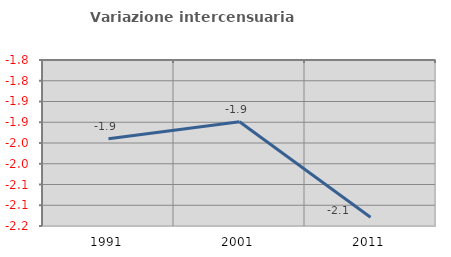
| Category | Variazione intercensuaria annua |
|---|---|
| 1991.0 | -1.94 |
| 2001.0 | -1.899 |
| 2011.0 | -2.129 |